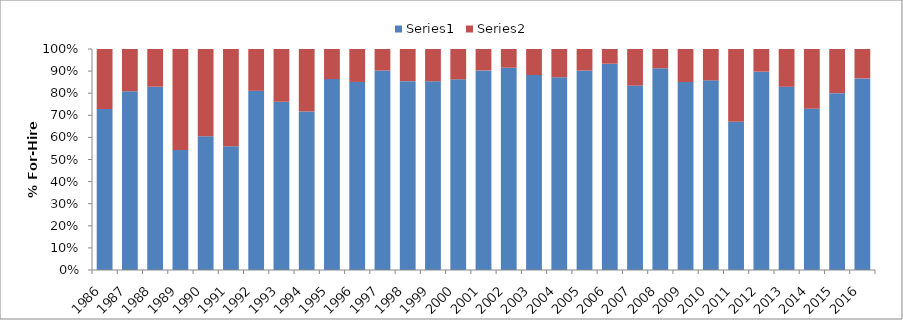
| Category | Series 0 | Series 1 |
|---|---|---|
| 1986.0 | 0.729 | 0.271 |
| 1987.0 | 0.809 | 0.191 |
| 1988.0 | 0.829 | 0.171 |
| 1989.0 | 0.543 | 0.457 |
| 1990.0 | 0.605 | 0.395 |
| 1991.0 | 0.56 | 0.44 |
| 1992.0 | 0.811 | 0.189 |
| 1993.0 | 0.761 | 0.239 |
| 1994.0 | 0.717 | 0.283 |
| 1995.0 | 0.864 | 0.136 |
| 1996.0 | 0.851 | 0.149 |
| 1997.0 | 0.903 | 0.097 |
| 1998.0 | 0.855 | 0.145 |
| 1999.0 | 0.854 | 0.146 |
| 2000.0 | 0.863 | 0.137 |
| 2001.0 | 0.903 | 0.097 |
| 2002.0 | 0.915 | 0.085 |
| 2003.0 | 0.882 | 0.118 |
| 2004.0 | 0.872 | 0.128 |
| 2005.0 | 0.903 | 0.097 |
| 2006.0 | 0.933 | 0.067 |
| 2007.0 | 0.834 | 0.166 |
| 2008.0 | 0.913 | 0.087 |
| 2009.0 | 0.851 | 0.149 |
| 2010.0 | 0.858 | 0.142 |
| 2011.0 | 0.671 | 0.329 |
| 2012.0 | 0.897 | 0.103 |
| 2013.0 | 0.829 | 0.171 |
| 2014.0 | 0.73 | 0.27 |
| 2015.0 | 0.8 | 0.2 |
| 2016.0 | 0.867 | 0.133 |